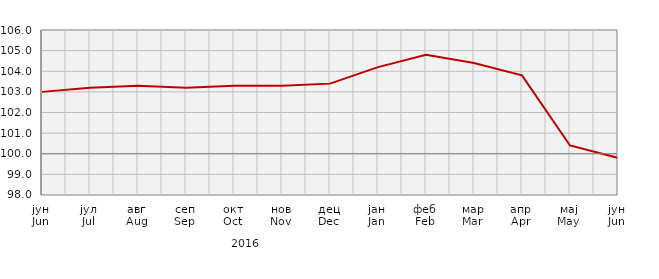
| Category | Series 0 |
|---|---|
| јун
Jun | 103 |
| јул
Jul | 103.2 |
| авг
Aug | 103.3 |
| сеп
Sep | 103.2 |
| окт
Oct | 103.3 |
| нов
Nov | 103.3 |
| дец
Dec | 103.4 |
| јан
Jan | 104.2 |
| феб
Feb | 104.8 |
| мар
Mar | 104.4 |
| апр
Apr | 103.8 |
| мај
May | 100.4 |
| јун
Jun | 99.8 |